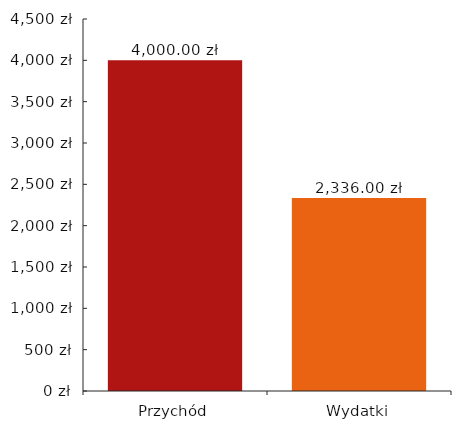
| Category | Dane_wykresu |
|---|---|
| 0 | 4000 |
| 1 | 2336 |